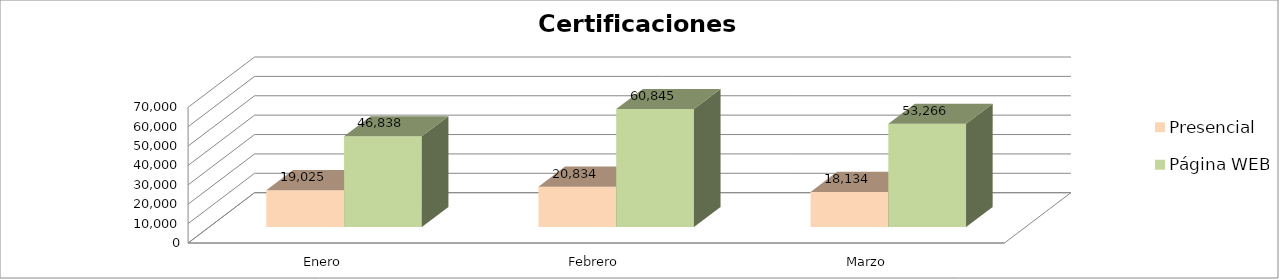
| Category | Presencial | Página WEB |
|---|---|---|
| Enero | 19025 | 46838 |
| Febrero | 20834 | 60845 |
| Marzo | 18134 | 53266 |